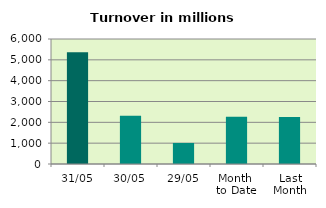
| Category | Series 0 |
|---|---|
| 31/05 | 5368.24 |
| 30/05 | 2321.167 |
| 29/05 | 1010.179 |
| Month 
to Date | 2265.206 |
| Last
Month | 2261.282 |